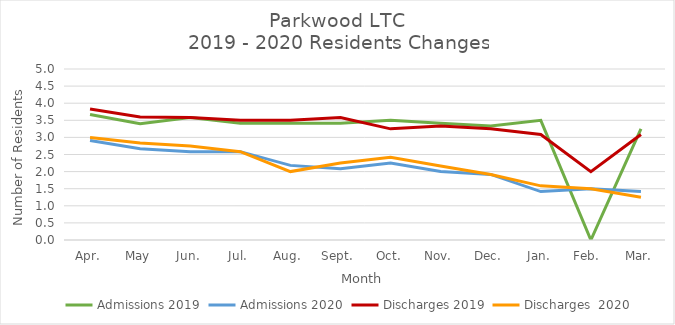
| Category | Admissions 2019 | Admissions 2020 | Discharges 2019 | Discharges  2020 |
|---|---|---|---|---|
| Apr. | 3.667 | 2.909 | 3.833 | 3 |
| May | 3.4 | 2.667 | 3.6 | 2.833 |
| Jun. | 3.583 | 2.583 | 3.583 | 2.75 |
| Jul. | 3.417 | 2.583 | 3.5 | 2.583 |
| Aug. | 3.417 | 2.182 | 3.5 | 2 |
| Sept. | 3.417 | 2.083 | 3.583 | 2.25 |
| Oct. | 3.5 | 2.25 | 3.25 | 2.417 |
| Nov. | 3.417 | 2 | 3.333 | 2.167 |
| Dec. | 3.333 | 1.917 | 3.25 | 1.917 |
| Jan. | 3.5 | 1.417 | 3.083 | 1.583 |
| Feb.  | 0 | 1.5 | 2 | 1.5 |
| Mar. | 3.25 | 1.417 | 3.083 | 1.25 |